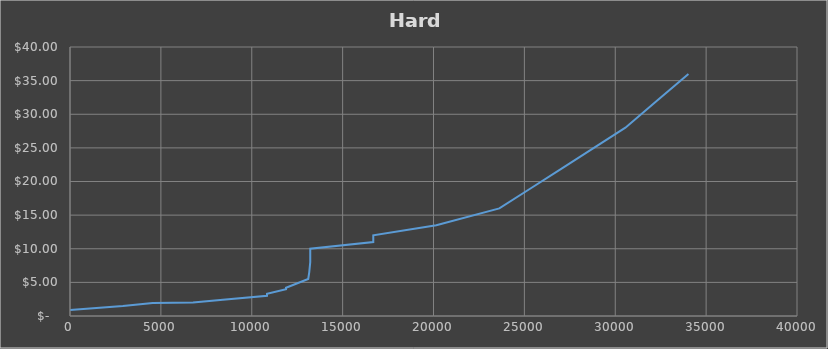
| Category | Series 0 |
|---|---|
| 0.0 | 0.9 |
| 1454.5 | 1.2 |
| 2909.0 | 1.5 |
| 4553.5 | 1.95 |
| 6768.43 | 2 |
| 8412.93 | 2.4 |
| 10839.0 | 3 |
| 10839.0 | 3.3 |
| 11886.09 | 4 |
| 11886.09 | 4.2 |
| 13107.09 | 5.5 |
| 13162.84 | 6.5 |
| 13162.84 | 6.6 |
| 13218.59 | 8 |
| 13218.59 | 9 |
| 13218.59 | 10 |
| 16686.523333333334 | 11 |
| 16686.523333333334 | 12 |
| 20154.45666666667 | 13.5 |
| 23622.390000000003 | 16 |
| 25356.35666666667 | 19 |
| 27090.323333333337 | 22 |
| 28824.290000000005 | 25 |
| 30558.25666666667 | 28 |
| 32292.22333333334 | 32 |
| 34026.19 | 36 |